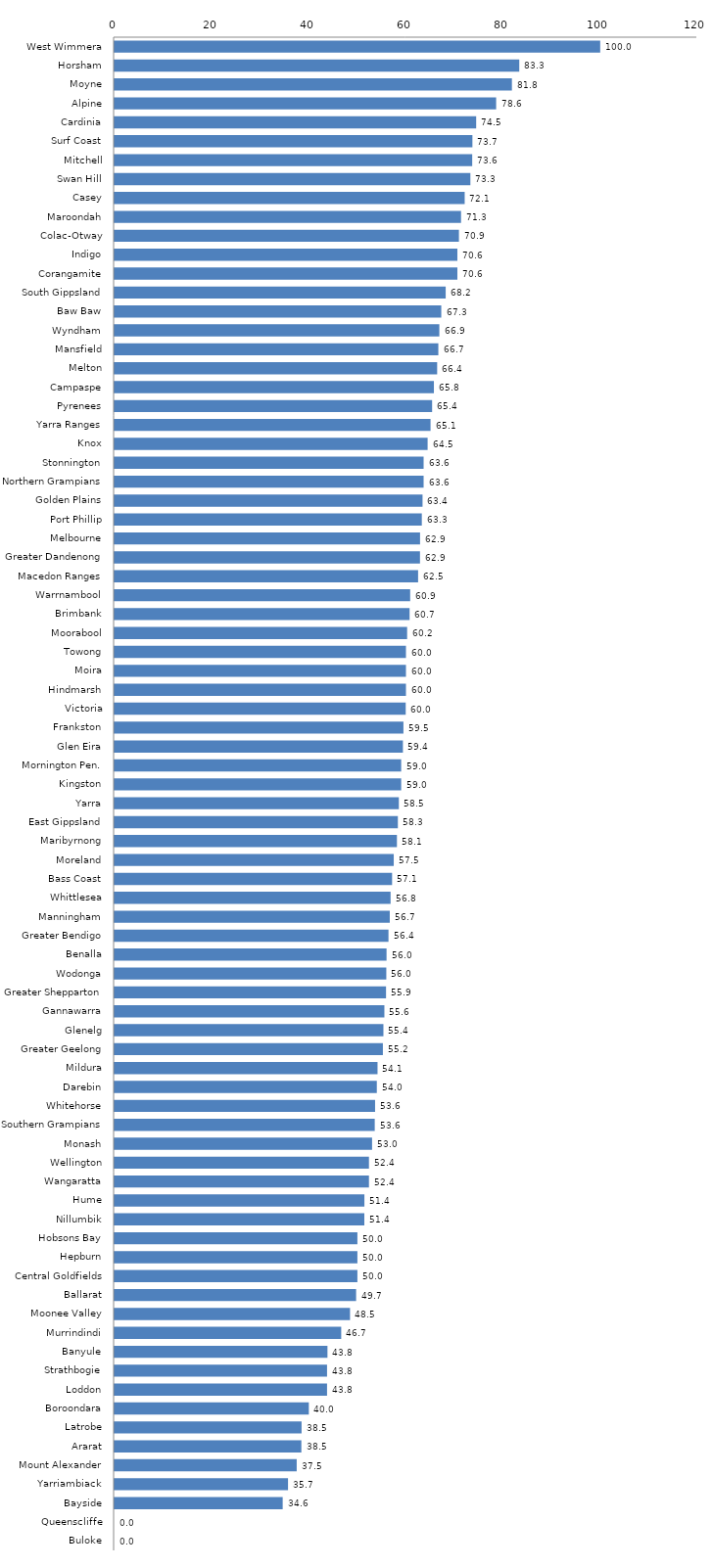
| Category | Series 0 |
|---|---|
| West Wimmera | 100 |
| Horsham | 83.333 |
| Moyne | 81.818 |
| Alpine | 78.571 |
| Cardinia | 74.459 |
| Surf Coast | 73.684 |
| Mitchell | 73.643 |
| Swan Hill | 73.267 |
| Casey | 72.093 |
| Maroondah | 71.341 |
| Colac-Otway | 70.909 |
| Indigo | 70.588 |
| Corangamite | 70.588 |
| South Gippsland | 68.182 |
| Baw Baw | 67.273 |
| Wyndham | 66.874 |
| Mansfield | 66.667 |
| Melton | 66.423 |
| Campaspe | 65.753 |
| Pyrenees | 65.385 |
| Yarra Ranges | 65.06 |
| Knox | 64.458 |
| Stonnington | 63.636 |
| Northern Grampians | 63.636 |
| Golden Plains | 63.415 |
| Port Phillip | 63.265 |
| Melbourne | 62.903 |
| Greater Dandenong | 62.89 |
| Macedon Ranges | 62.5 |
| Warrnambool | 60.87 |
| Brimbank | 60.748 |
| Moorabool | 60.241 |
| Towong | 60 |
| Moira | 60 |
| Hindmarsh | 60 |
| Victoria | 59.95 |
| Frankston | 59.48 |
| Glen Eira | 59.375 |
| Mornington Pen. | 59.016 |
| Kingston | 59.016 |
| Yarra | 58.537 |
| East Gippsland | 58.333 |
| Maribyrnong | 58.14 |
| Moreland | 57.485 |
| Bass Coast | 57.143 |
| Whittlesea | 56.833 |
| Manningham | 56.667 |
| Greater Bendigo | 56.4 |
| Benalla | 56 |
| Wodonga | 55.952 |
| Greater Shepparton | 55.895 |
| Gannawarra | 55.556 |
| Glenelg | 55.357 |
| Greater Geelong | 55.249 |
| Mildura | 54.146 |
| Darebin | 54 |
| Whitehorse | 53.642 |
| Southern Grampians | 53.571 |
| Monash | 53.02 |
| Wellington | 52.381 |
| Wangaratta | 52.381 |
| Hume | 51.443 |
| Nillumbik | 51.429 |
| Hobsons Bay | 50 |
| Hepburn | 50 |
| Central Goldfields | 50 |
| Ballarat | 49.735 |
| Moonee Valley | 48.485 |
| Murrindindi | 46.667 |
| Banyule | 43.836 |
| Strathbogie | 43.75 |
| Loddon | 43.75 |
| Boroondara | 40 |
| Latrobe | 38.503 |
| Ararat | 38.462 |
| Mount Alexander | 37.5 |
| Yarriambiack | 35.714 |
| Bayside | 34.615 |
| Queenscliffe | 0 |
| Buloke | 0 |